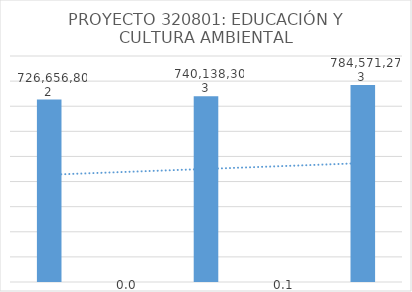
| Category | Series 0 |
|---|---|
| 0 | 726656802 |
| 1 | 0.019 |
| 2 | 740138303 |
| 3 | 0.06 |
| 4 | 784571273.329 |